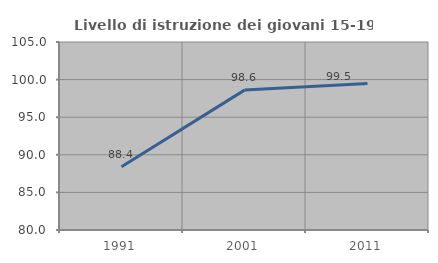
| Category | Livello di istruzione dei giovani 15-19 anni |
|---|---|
| 1991.0 | 88.4 |
| 2001.0 | 98.601 |
| 2011.0 | 99.497 |